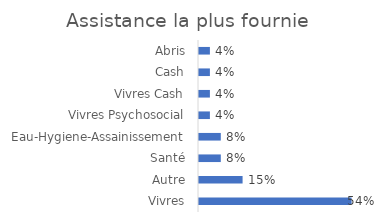
| Category | Total |
|---|---|
| Vivres | 0.538 |
| Autre | 0.154 |
| Santé | 0.077 |
| Eau-Hygiene-Assainissement | 0.077 |
| Vivres Psychosocial | 0.038 |
| Vivres Cash | 0.038 |
| Cash | 0.038 |
| Abris | 0.038 |